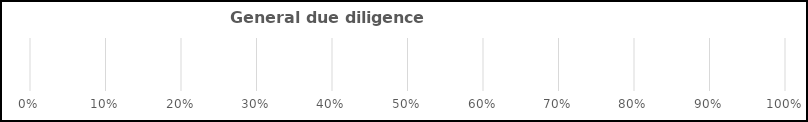
| Category | Red | Series 1 | Green |
|---|---|---|---|
| 0 | 0 |  | 0 |